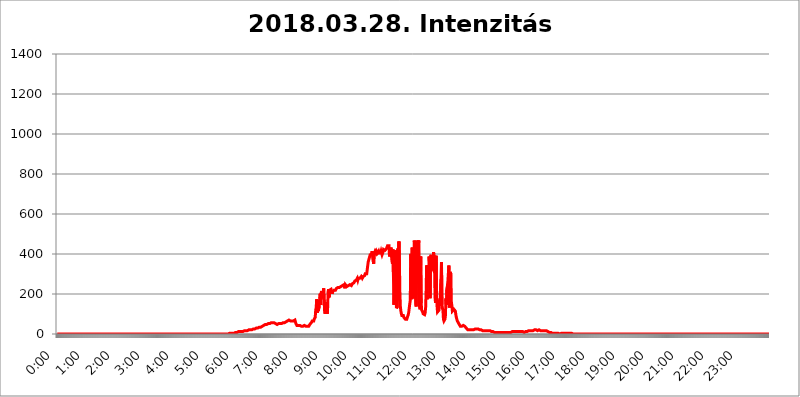
| Category | 2018.03.28. Intenzitás [W/m^2] |
|---|---|
| 0.0 | 0 |
| 0.0006944444444444445 | 0 |
| 0.001388888888888889 | 0 |
| 0.0020833333333333333 | 0 |
| 0.002777777777777778 | 0 |
| 0.003472222222222222 | 0 |
| 0.004166666666666667 | 0 |
| 0.004861111111111111 | 0 |
| 0.005555555555555556 | 0 |
| 0.0062499999999999995 | 0 |
| 0.006944444444444444 | 0 |
| 0.007638888888888889 | 0 |
| 0.008333333333333333 | 0 |
| 0.009027777777777779 | 0 |
| 0.009722222222222222 | 0 |
| 0.010416666666666666 | 0 |
| 0.011111111111111112 | 0 |
| 0.011805555555555555 | 0 |
| 0.012499999999999999 | 0 |
| 0.013194444444444444 | 0 |
| 0.013888888888888888 | 0 |
| 0.014583333333333332 | 0 |
| 0.015277777777777777 | 0 |
| 0.015972222222222224 | 0 |
| 0.016666666666666666 | 0 |
| 0.017361111111111112 | 0 |
| 0.018055555555555557 | 0 |
| 0.01875 | 0 |
| 0.019444444444444445 | 0 |
| 0.02013888888888889 | 0 |
| 0.020833333333333332 | 0 |
| 0.02152777777777778 | 0 |
| 0.022222222222222223 | 0 |
| 0.02291666666666667 | 0 |
| 0.02361111111111111 | 0 |
| 0.024305555555555556 | 0 |
| 0.024999999999999998 | 0 |
| 0.025694444444444447 | 0 |
| 0.02638888888888889 | 0 |
| 0.027083333333333334 | 0 |
| 0.027777777777777776 | 0 |
| 0.02847222222222222 | 0 |
| 0.029166666666666664 | 0 |
| 0.029861111111111113 | 0 |
| 0.030555555555555555 | 0 |
| 0.03125 | 0 |
| 0.03194444444444445 | 0 |
| 0.03263888888888889 | 0 |
| 0.03333333333333333 | 0 |
| 0.034027777777777775 | 0 |
| 0.034722222222222224 | 0 |
| 0.035416666666666666 | 0 |
| 0.036111111111111115 | 0 |
| 0.03680555555555556 | 0 |
| 0.0375 | 0 |
| 0.03819444444444444 | 0 |
| 0.03888888888888889 | 0 |
| 0.03958333333333333 | 0 |
| 0.04027777777777778 | 0 |
| 0.04097222222222222 | 0 |
| 0.041666666666666664 | 0 |
| 0.042361111111111106 | 0 |
| 0.04305555555555556 | 0 |
| 0.043750000000000004 | 0 |
| 0.044444444444444446 | 0 |
| 0.04513888888888889 | 0 |
| 0.04583333333333334 | 0 |
| 0.04652777777777778 | 0 |
| 0.04722222222222222 | 0 |
| 0.04791666666666666 | 0 |
| 0.04861111111111111 | 0 |
| 0.049305555555555554 | 0 |
| 0.049999999999999996 | 0 |
| 0.05069444444444445 | 0 |
| 0.051388888888888894 | 0 |
| 0.052083333333333336 | 0 |
| 0.05277777777777778 | 0 |
| 0.05347222222222222 | 0 |
| 0.05416666666666667 | 0 |
| 0.05486111111111111 | 0 |
| 0.05555555555555555 | 0 |
| 0.05625 | 0 |
| 0.05694444444444444 | 0 |
| 0.057638888888888885 | 0 |
| 0.05833333333333333 | 0 |
| 0.05902777777777778 | 0 |
| 0.059722222222222225 | 0 |
| 0.06041666666666667 | 0 |
| 0.061111111111111116 | 0 |
| 0.06180555555555556 | 0 |
| 0.0625 | 0 |
| 0.06319444444444444 | 0 |
| 0.06388888888888888 | 0 |
| 0.06458333333333334 | 0 |
| 0.06527777777777778 | 0 |
| 0.06597222222222222 | 0 |
| 0.06666666666666667 | 0 |
| 0.06736111111111111 | 0 |
| 0.06805555555555555 | 0 |
| 0.06874999999999999 | 0 |
| 0.06944444444444443 | 0 |
| 0.07013888888888889 | 0 |
| 0.07083333333333333 | 0 |
| 0.07152777777777779 | 0 |
| 0.07222222222222223 | 0 |
| 0.07291666666666667 | 0 |
| 0.07361111111111111 | 0 |
| 0.07430555555555556 | 0 |
| 0.075 | 0 |
| 0.07569444444444444 | 0 |
| 0.0763888888888889 | 0 |
| 0.07708333333333334 | 0 |
| 0.07777777777777778 | 0 |
| 0.07847222222222222 | 0 |
| 0.07916666666666666 | 0 |
| 0.0798611111111111 | 0 |
| 0.08055555555555556 | 0 |
| 0.08125 | 0 |
| 0.08194444444444444 | 0 |
| 0.08263888888888889 | 0 |
| 0.08333333333333333 | 0 |
| 0.08402777777777777 | 0 |
| 0.08472222222222221 | 0 |
| 0.08541666666666665 | 0 |
| 0.08611111111111112 | 0 |
| 0.08680555555555557 | 0 |
| 0.08750000000000001 | 0 |
| 0.08819444444444445 | 0 |
| 0.08888888888888889 | 0 |
| 0.08958333333333333 | 0 |
| 0.09027777777777778 | 0 |
| 0.09097222222222222 | 0 |
| 0.09166666666666667 | 0 |
| 0.09236111111111112 | 0 |
| 0.09305555555555556 | 0 |
| 0.09375 | 0 |
| 0.09444444444444444 | 0 |
| 0.09513888888888888 | 0 |
| 0.09583333333333333 | 0 |
| 0.09652777777777777 | 0 |
| 0.09722222222222222 | 0 |
| 0.09791666666666667 | 0 |
| 0.09861111111111111 | 0 |
| 0.09930555555555555 | 0 |
| 0.09999999999999999 | 0 |
| 0.10069444444444443 | 0 |
| 0.1013888888888889 | 0 |
| 0.10208333333333335 | 0 |
| 0.10277777777777779 | 0 |
| 0.10347222222222223 | 0 |
| 0.10416666666666667 | 0 |
| 0.10486111111111111 | 0 |
| 0.10555555555555556 | 0 |
| 0.10625 | 0 |
| 0.10694444444444444 | 0 |
| 0.1076388888888889 | 0 |
| 0.10833333333333334 | 0 |
| 0.10902777777777778 | 0 |
| 0.10972222222222222 | 0 |
| 0.1111111111111111 | 0 |
| 0.11180555555555556 | 0 |
| 0.11180555555555556 | 0 |
| 0.1125 | 0 |
| 0.11319444444444444 | 0 |
| 0.11388888888888889 | 0 |
| 0.11458333333333333 | 0 |
| 0.11527777777777777 | 0 |
| 0.11597222222222221 | 0 |
| 0.11666666666666665 | 0 |
| 0.1173611111111111 | 0 |
| 0.11805555555555557 | 0 |
| 0.11944444444444445 | 0 |
| 0.12013888888888889 | 0 |
| 0.12083333333333333 | 0 |
| 0.12152777777777778 | 0 |
| 0.12222222222222223 | 0 |
| 0.12291666666666667 | 0 |
| 0.12291666666666667 | 0 |
| 0.12361111111111112 | 0 |
| 0.12430555555555556 | 0 |
| 0.125 | 0 |
| 0.12569444444444444 | 0 |
| 0.12638888888888888 | 0 |
| 0.12708333333333333 | 0 |
| 0.16875 | 0 |
| 0.12847222222222224 | 0 |
| 0.12916666666666668 | 0 |
| 0.12986111111111112 | 0 |
| 0.13055555555555556 | 0 |
| 0.13125 | 0 |
| 0.13194444444444445 | 0 |
| 0.1326388888888889 | 0 |
| 0.13333333333333333 | 0 |
| 0.13402777777777777 | 0 |
| 0.13402777777777777 | 0 |
| 0.13472222222222222 | 0 |
| 0.13541666666666666 | 0 |
| 0.1361111111111111 | 0 |
| 0.13749999999999998 | 0 |
| 0.13819444444444443 | 0 |
| 0.1388888888888889 | 0 |
| 0.13958333333333334 | 0 |
| 0.14027777777777778 | 0 |
| 0.14097222222222222 | 0 |
| 0.14166666666666666 | 0 |
| 0.1423611111111111 | 0 |
| 0.14305555555555557 | 0 |
| 0.14375000000000002 | 0 |
| 0.14444444444444446 | 0 |
| 0.1451388888888889 | 0 |
| 0.1451388888888889 | 0 |
| 0.14652777777777778 | 0 |
| 0.14722222222222223 | 0 |
| 0.14791666666666667 | 0 |
| 0.1486111111111111 | 0 |
| 0.14930555555555555 | 0 |
| 0.15 | 0 |
| 0.15069444444444444 | 0 |
| 0.15138888888888888 | 0 |
| 0.15208333333333332 | 0 |
| 0.15277777777777776 | 0 |
| 0.15347222222222223 | 0 |
| 0.15416666666666667 | 0 |
| 0.15486111111111112 | 0 |
| 0.15555555555555556 | 0 |
| 0.15625 | 0 |
| 0.15694444444444444 | 0 |
| 0.15763888888888888 | 0 |
| 0.15833333333333333 | 0 |
| 0.15902777777777777 | 0 |
| 0.15972222222222224 | 0 |
| 0.16041666666666668 | 0 |
| 0.16111111111111112 | 0 |
| 0.16180555555555556 | 0 |
| 0.1625 | 0 |
| 0.16319444444444445 | 0 |
| 0.1638888888888889 | 0 |
| 0.16458333333333333 | 0 |
| 0.16527777777777777 | 0 |
| 0.16597222222222222 | 0 |
| 0.16666666666666666 | 0 |
| 0.1673611111111111 | 0 |
| 0.16805555555555554 | 0 |
| 0.16874999999999998 | 0 |
| 0.16944444444444443 | 0 |
| 0.17013888888888887 | 0 |
| 0.1708333333333333 | 0 |
| 0.17152777777777775 | 0 |
| 0.17222222222222225 | 0 |
| 0.1729166666666667 | 0 |
| 0.17361111111111113 | 0 |
| 0.17430555555555557 | 0 |
| 0.17500000000000002 | 0 |
| 0.17569444444444446 | 0 |
| 0.1763888888888889 | 0 |
| 0.17708333333333334 | 0 |
| 0.17777777777777778 | 0 |
| 0.17847222222222223 | 0 |
| 0.17916666666666667 | 0 |
| 0.1798611111111111 | 0 |
| 0.18055555555555555 | 0 |
| 0.18125 | 0 |
| 0.18194444444444444 | 0 |
| 0.1826388888888889 | 0 |
| 0.18333333333333335 | 0 |
| 0.1840277777777778 | 0 |
| 0.18472222222222223 | 0 |
| 0.18541666666666667 | 0 |
| 0.18611111111111112 | 0 |
| 0.18680555555555556 | 0 |
| 0.1875 | 0 |
| 0.18819444444444444 | 0 |
| 0.18888888888888888 | 0 |
| 0.18958333333333333 | 0 |
| 0.19027777777777777 | 0 |
| 0.1909722222222222 | 0 |
| 0.19166666666666665 | 0 |
| 0.19236111111111112 | 0 |
| 0.19305555555555554 | 0 |
| 0.19375 | 0 |
| 0.19444444444444445 | 0 |
| 0.1951388888888889 | 0 |
| 0.19583333333333333 | 0 |
| 0.19652777777777777 | 0 |
| 0.19722222222222222 | 0 |
| 0.19791666666666666 | 0 |
| 0.1986111111111111 | 0 |
| 0.19930555555555554 | 0 |
| 0.19999999999999998 | 0 |
| 0.20069444444444443 | 0 |
| 0.20138888888888887 | 0 |
| 0.2020833333333333 | 0 |
| 0.2027777777777778 | 0 |
| 0.2034722222222222 | 0 |
| 0.2041666666666667 | 0 |
| 0.20486111111111113 | 0 |
| 0.20555555555555557 | 0 |
| 0.20625000000000002 | 0 |
| 0.20694444444444446 | 0 |
| 0.2076388888888889 | 0 |
| 0.20833333333333334 | 0 |
| 0.20902777777777778 | 0 |
| 0.20972222222222223 | 0 |
| 0.21041666666666667 | 0 |
| 0.2111111111111111 | 0 |
| 0.21180555555555555 | 0 |
| 0.2125 | 0 |
| 0.21319444444444444 | 0 |
| 0.2138888888888889 | 0 |
| 0.21458333333333335 | 0 |
| 0.2152777777777778 | 0 |
| 0.21597222222222223 | 0 |
| 0.21666666666666667 | 0 |
| 0.21736111111111112 | 0 |
| 0.21805555555555556 | 0 |
| 0.21875 | 0 |
| 0.21944444444444444 | 0 |
| 0.22013888888888888 | 0 |
| 0.22083333333333333 | 0 |
| 0.22152777777777777 | 0 |
| 0.2222222222222222 | 0 |
| 0.22291666666666665 | 0 |
| 0.2236111111111111 | 0 |
| 0.22430555555555556 | 0 |
| 0.225 | 0 |
| 0.22569444444444445 | 0 |
| 0.2263888888888889 | 0 |
| 0.22708333333333333 | 0 |
| 0.22777777777777777 | 0 |
| 0.22847222222222222 | 0 |
| 0.22916666666666666 | 0 |
| 0.2298611111111111 | 0 |
| 0.23055555555555554 | 0 |
| 0.23124999999999998 | 0 |
| 0.23194444444444443 | 0 |
| 0.23263888888888887 | 0 |
| 0.2333333333333333 | 0 |
| 0.2340277777777778 | 0 |
| 0.2347222222222222 | 0 |
| 0.2354166666666667 | 0 |
| 0.23611111111111113 | 0 |
| 0.23680555555555557 | 0 |
| 0.23750000000000002 | 0 |
| 0.23819444444444446 | 0 |
| 0.2388888888888889 | 3.525 |
| 0.23958333333333334 | 0 |
| 0.24027777777777778 | 3.525 |
| 0.24097222222222223 | 3.525 |
| 0.24166666666666667 | 3.525 |
| 0.2423611111111111 | 3.525 |
| 0.24305555555555555 | 3.525 |
| 0.24375 | 3.525 |
| 0.24444444444444446 | 3.525 |
| 0.24513888888888888 | 3.525 |
| 0.24583333333333335 | 3.525 |
| 0.2465277777777778 | 3.525 |
| 0.24722222222222223 | 3.525 |
| 0.24791666666666667 | 3.525 |
| 0.24861111111111112 | 3.525 |
| 0.24930555555555556 | 7.887 |
| 0.25 | 7.887 |
| 0.25069444444444444 | 7.887 |
| 0.2513888888888889 | 7.887 |
| 0.2520833333333333 | 7.887 |
| 0.25277777777777777 | 7.887 |
| 0.2534722222222222 | 7.887 |
| 0.25416666666666665 | 12.257 |
| 0.2548611111111111 | 7.887 |
| 0.2555555555555556 | 12.257 |
| 0.25625000000000003 | 12.257 |
| 0.2569444444444445 | 12.257 |
| 0.2576388888888889 | 12.257 |
| 0.25833333333333336 | 12.257 |
| 0.2590277777777778 | 12.257 |
| 0.25972222222222224 | 12.257 |
| 0.2604166666666667 | 12.257 |
| 0.2611111111111111 | 12.257 |
| 0.26180555555555557 | 12.257 |
| 0.2625 | 16.636 |
| 0.26319444444444445 | 16.636 |
| 0.2638888888888889 | 16.636 |
| 0.26458333333333334 | 16.636 |
| 0.2652777777777778 | 16.636 |
| 0.2659722222222222 | 16.636 |
| 0.26666666666666666 | 16.636 |
| 0.2673611111111111 | 16.636 |
| 0.26805555555555555 | 16.636 |
| 0.26875 | 21.024 |
| 0.26944444444444443 | 21.024 |
| 0.2701388888888889 | 21.024 |
| 0.2708333333333333 | 21.024 |
| 0.27152777777777776 | 21.024 |
| 0.2722222222222222 | 21.024 |
| 0.27291666666666664 | 21.024 |
| 0.2736111111111111 | 21.024 |
| 0.2743055555555555 | 21.024 |
| 0.27499999999999997 | 25.419 |
| 0.27569444444444446 | 25.419 |
| 0.27638888888888885 | 25.419 |
| 0.27708333333333335 | 25.419 |
| 0.2777777777777778 | 25.419 |
| 0.27847222222222223 | 25.419 |
| 0.2791666666666667 | 29.823 |
| 0.2798611111111111 | 29.823 |
| 0.28055555555555556 | 29.823 |
| 0.28125 | 29.823 |
| 0.28194444444444444 | 29.823 |
| 0.2826388888888889 | 29.823 |
| 0.2833333333333333 | 34.234 |
| 0.28402777777777777 | 34.234 |
| 0.2847222222222222 | 34.234 |
| 0.28541666666666665 | 34.234 |
| 0.28611111111111115 | 34.234 |
| 0.28680555555555554 | 38.653 |
| 0.28750000000000003 | 38.653 |
| 0.2881944444444445 | 38.653 |
| 0.2888888888888889 | 38.653 |
| 0.28958333333333336 | 43.079 |
| 0.2902777777777778 | 43.079 |
| 0.29097222222222224 | 43.079 |
| 0.2916666666666667 | 47.511 |
| 0.2923611111111111 | 47.511 |
| 0.29305555555555557 | 47.511 |
| 0.29375 | 47.511 |
| 0.29444444444444445 | 47.511 |
| 0.2951388888888889 | 47.511 |
| 0.29583333333333334 | 51.951 |
| 0.2965277777777778 | 51.951 |
| 0.2972222222222222 | 51.951 |
| 0.29791666666666666 | 51.951 |
| 0.2986111111111111 | 56.398 |
| 0.29930555555555555 | 56.398 |
| 0.3 | 56.398 |
| 0.30069444444444443 | 56.398 |
| 0.3013888888888889 | 56.398 |
| 0.3020833333333333 | 56.398 |
| 0.30277777777777776 | 56.398 |
| 0.3034722222222222 | 56.398 |
| 0.30416666666666664 | 56.398 |
| 0.3048611111111111 | 56.398 |
| 0.3055555555555555 | 51.951 |
| 0.30624999999999997 | 51.951 |
| 0.3069444444444444 | 47.511 |
| 0.3076388888888889 | 47.511 |
| 0.30833333333333335 | 47.511 |
| 0.3090277777777778 | 47.511 |
| 0.30972222222222223 | 47.511 |
| 0.3104166666666667 | 51.951 |
| 0.3111111111111111 | 51.951 |
| 0.31180555555555556 | 51.951 |
| 0.3125 | 51.951 |
| 0.31319444444444444 | 51.951 |
| 0.3138888888888889 | 51.951 |
| 0.3145833333333333 | 51.951 |
| 0.31527777777777777 | 56.398 |
| 0.3159722222222222 | 56.398 |
| 0.31666666666666665 | 56.398 |
| 0.31736111111111115 | 56.398 |
| 0.31805555555555554 | 56.398 |
| 0.31875000000000003 | 56.398 |
| 0.3194444444444445 | 60.85 |
| 0.3201388888888889 | 60.85 |
| 0.32083333333333336 | 60.85 |
| 0.3215277777777778 | 65.31 |
| 0.32222222222222224 | 65.31 |
| 0.3229166666666667 | 65.31 |
| 0.3236111111111111 | 65.31 |
| 0.32430555555555557 | 65.31 |
| 0.325 | 69.775 |
| 0.32569444444444445 | 65.31 |
| 0.3263888888888889 | 65.31 |
| 0.32708333333333334 | 65.31 |
| 0.3277777777777778 | 65.31 |
| 0.3284722222222222 | 65.31 |
| 0.32916666666666666 | 65.31 |
| 0.3298611111111111 | 65.31 |
| 0.33055555555555555 | 65.31 |
| 0.33125 | 65.31 |
| 0.33194444444444443 | 69.775 |
| 0.3326388888888889 | 69.775 |
| 0.3333333333333333 | 69.775 |
| 0.3340277777777778 | 60.85 |
| 0.3347222222222222 | 51.951 |
| 0.3354166666666667 | 47.511 |
| 0.3361111111111111 | 43.079 |
| 0.3368055555555556 | 43.079 |
| 0.33749999999999997 | 43.079 |
| 0.33819444444444446 | 43.079 |
| 0.33888888888888885 | 43.079 |
| 0.33958333333333335 | 43.079 |
| 0.34027777777777773 | 43.079 |
| 0.34097222222222223 | 47.511 |
| 0.3416666666666666 | 38.653 |
| 0.3423611111111111 | 38.653 |
| 0.3430555555555555 | 38.653 |
| 0.34375 | 38.653 |
| 0.3444444444444445 | 38.653 |
| 0.3451388888888889 | 38.653 |
| 0.3458333333333334 | 43.079 |
| 0.34652777777777777 | 43.079 |
| 0.34722222222222227 | 38.653 |
| 0.34791666666666665 | 38.653 |
| 0.34861111111111115 | 38.653 |
| 0.34930555555555554 | 38.653 |
| 0.35000000000000003 | 38.653 |
| 0.3506944444444444 | 38.653 |
| 0.3513888888888889 | 38.653 |
| 0.3520833333333333 | 38.653 |
| 0.3527777777777778 | 38.653 |
| 0.3534722222222222 | 43.079 |
| 0.3541666666666667 | 47.511 |
| 0.3548611111111111 | 47.511 |
| 0.35555555555555557 | 51.951 |
| 0.35625 | 56.398 |
| 0.35694444444444445 | 60.85 |
| 0.3576388888888889 | 65.31 |
| 0.35833333333333334 | 65.31 |
| 0.3590277777777778 | 65.31 |
| 0.3597222222222222 | 65.31 |
| 0.36041666666666666 | 74.246 |
| 0.3611111111111111 | 74.246 |
| 0.36180555555555555 | 83.205 |
| 0.3625 | 119.235 |
| 0.36319444444444443 | 132.814 |
| 0.3638888888888889 | 173.709 |
| 0.3645833333333333 | 105.69 |
| 0.3652777777777778 | 150.964 |
| 0.3659722222222222 | 114.716 |
| 0.3666666666666667 | 110.201 |
| 0.3673611111111111 | 137.347 |
| 0.3680555555555556 | 173.709 |
| 0.36874999999999997 | 201.058 |
| 0.36944444444444446 | 146.423 |
| 0.37013888888888885 | 205.62 |
| 0.37083333333333335 | 214.746 |
| 0.37152777777777773 | 201.058 |
| 0.37222222222222223 | 178.264 |
| 0.3729166666666666 | 210.182 |
| 0.3736111111111111 | 228.436 |
| 0.3743055555555555 | 233 |
| 0.375 | 114.716 |
| 0.3756944444444445 | 101.184 |
| 0.3763888888888889 | 119.235 |
| 0.3770833333333334 | 137.347 |
| 0.37777777777777777 | 160.056 |
| 0.37847222222222227 | 101.184 |
| 0.37916666666666665 | 123.758 |
| 0.37986111111111115 | 210.182 |
| 0.38055555555555554 | 223.873 |
| 0.38125000000000003 | 182.82 |
| 0.3819444444444444 | 219.309 |
| 0.3826388888888889 | 223.873 |
| 0.3833333333333333 | 223.873 |
| 0.3840277777777778 | 223.873 |
| 0.3847222222222222 | 214.746 |
| 0.3854166666666667 | 201.058 |
| 0.3861111111111111 | 210.182 |
| 0.38680555555555557 | 210.182 |
| 0.3875 | 214.746 |
| 0.38819444444444445 | 219.309 |
| 0.3888888888888889 | 219.309 |
| 0.38958333333333334 | 219.309 |
| 0.3902777777777778 | 219.309 |
| 0.3909722222222222 | 223.873 |
| 0.39166666666666666 | 228.436 |
| 0.3923611111111111 | 228.436 |
| 0.39305555555555555 | 233 |
| 0.39375 | 233 |
| 0.39444444444444443 | 237.564 |
| 0.3951388888888889 | 237.564 |
| 0.3958333333333333 | 233 |
| 0.3965277777777778 | 233 |
| 0.3972222222222222 | 233 |
| 0.3979166666666667 | 237.564 |
| 0.3986111111111111 | 237.564 |
| 0.3993055555555556 | 242.127 |
| 0.39999999999999997 | 242.127 |
| 0.40069444444444446 | 246.689 |
| 0.40138888888888885 | 246.689 |
| 0.40208333333333335 | 246.689 |
| 0.40277777777777773 | 237.564 |
| 0.40347222222222223 | 228.436 |
| 0.4041666666666666 | 246.689 |
| 0.4048611111111111 | 242.127 |
| 0.4055555555555555 | 242.127 |
| 0.40625 | 237.564 |
| 0.4069444444444445 | 242.127 |
| 0.4076388888888889 | 242.127 |
| 0.4083333333333334 | 242.127 |
| 0.40902777777777777 | 242.127 |
| 0.40972222222222227 | 242.127 |
| 0.41041666666666665 | 246.689 |
| 0.41111111111111115 | 242.127 |
| 0.41180555555555554 | 242.127 |
| 0.41250000000000003 | 242.127 |
| 0.4131944444444444 | 246.689 |
| 0.4138888888888889 | 251.251 |
| 0.4145833333333333 | 251.251 |
| 0.4152777777777778 | 251.251 |
| 0.4159722222222222 | 255.813 |
| 0.4166666666666667 | 260.373 |
| 0.4173611111111111 | 264.932 |
| 0.41805555555555557 | 269.49 |
| 0.41875 | 264.932 |
| 0.41944444444444445 | 269.49 |
| 0.4201388888888889 | 274.047 |
| 0.42083333333333334 | 278.603 |
| 0.4215277777777778 | 269.49 |
| 0.4222222222222222 | 278.603 |
| 0.42291666666666666 | 278.603 |
| 0.4236111111111111 | 283.156 |
| 0.42430555555555555 | 278.603 |
| 0.425 | 274.047 |
| 0.42569444444444443 | 283.156 |
| 0.4263888888888889 | 287.709 |
| 0.4270833333333333 | 283.156 |
| 0.4277777777777778 | 278.603 |
| 0.4284722222222222 | 278.603 |
| 0.4291666666666667 | 287.709 |
| 0.4298611111111111 | 292.259 |
| 0.4305555555555556 | 292.259 |
| 0.43124999999999997 | 292.259 |
| 0.43194444444444446 | 301.354 |
| 0.43263888888888885 | 296.808 |
| 0.43333333333333335 | 301.354 |
| 0.43402777777777773 | 301.354 |
| 0.43472222222222223 | 305.898 |
| 0.4354166666666666 | 305.898 |
| 0.4361111111111111 | 360.221 |
| 0.4368055555555555 | 369.23 |
| 0.4375 | 378.224 |
| 0.4381944444444445 | 382.715 |
| 0.4388888888888889 | 396.164 |
| 0.4395833333333334 | 396.164 |
| 0.44027777777777777 | 396.164 |
| 0.44097222222222227 | 400.638 |
| 0.44166666666666665 | 414.035 |
| 0.44236111111111115 | 414.035 |
| 0.44305555555555554 | 418.492 |
| 0.44375000000000003 | 351.198 |
| 0.4444444444444444 | 400.638 |
| 0.4451388888888889 | 405.108 |
| 0.4458333333333333 | 414.035 |
| 0.4465277777777778 | 409.574 |
| 0.4472222222222222 | 405.108 |
| 0.4479166666666667 | 414.035 |
| 0.4486111111111111 | 414.035 |
| 0.44930555555555557 | 405.108 |
| 0.45 | 409.574 |
| 0.45069444444444445 | 414.035 |
| 0.4513888888888889 | 405.108 |
| 0.45208333333333334 | 405.108 |
| 0.4527777777777778 | 405.108 |
| 0.4534722222222222 | 405.108 |
| 0.45416666666666666 | 414.035 |
| 0.4548611111111111 | 414.035 |
| 0.45555555555555555 | 396.164 |
| 0.45625 | 400.638 |
| 0.45694444444444443 | 409.574 |
| 0.4576388888888889 | 422.943 |
| 0.4583333333333333 | 422.943 |
| 0.4590277777777778 | 418.492 |
| 0.4597222222222222 | 418.492 |
| 0.4604166666666667 | 414.035 |
| 0.4611111111111111 | 414.035 |
| 0.4618055555555556 | 427.39 |
| 0.46249999999999997 | 431.833 |
| 0.46319444444444446 | 440.702 |
| 0.46388888888888885 | 440.702 |
| 0.46458333333333335 | 440.702 |
| 0.46527777777777773 | 440.702 |
| 0.46597222222222223 | 387.202 |
| 0.4666666666666666 | 391.685 |
| 0.4673611111111111 | 391.685 |
| 0.4680555555555555 | 431.833 |
| 0.46875 | 391.685 |
| 0.4694444444444445 | 364.728 |
| 0.4701388888888889 | 351.198 |
| 0.4708333333333334 | 422.943 |
| 0.47152777777777777 | 292.259 |
| 0.47222222222222227 | 146.423 |
| 0.47291666666666665 | 146.423 |
| 0.47361111111111115 | 337.639 |
| 0.47430555555555554 | 418.492 |
| 0.47500000000000003 | 382.715 |
| 0.4756944444444444 | 128.284 |
| 0.4763888888888889 | 123.758 |
| 0.4770833333333333 | 137.347 |
| 0.4777777777777778 | 427.39 |
| 0.4784722222222222 | 169.156 |
| 0.4791666666666667 | 462.786 |
| 0.4798611111111111 | 369.23 |
| 0.48055555555555557 | 205.62 |
| 0.48125 | 137.347 |
| 0.48194444444444445 | 114.716 |
| 0.4826388888888889 | 101.184 |
| 0.48333333333333334 | 92.184 |
| 0.4840277777777778 | 87.692 |
| 0.4847222222222222 | 96.682 |
| 0.48541666666666666 | 92.184 |
| 0.4861111111111111 | 83.205 |
| 0.48680555555555555 | 83.205 |
| 0.4875 | 78.722 |
| 0.48819444444444443 | 74.246 |
| 0.4888888888888889 | 74.246 |
| 0.4895833333333333 | 74.246 |
| 0.4902777777777778 | 74.246 |
| 0.4909722222222222 | 83.205 |
| 0.4916666666666667 | 87.692 |
| 0.4923611111111111 | 96.682 |
| 0.4930555555555556 | 110.201 |
| 0.49374999999999997 | 132.814 |
| 0.49444444444444446 | 132.814 |
| 0.49513888888888885 | 169.156 |
| 0.49583333333333335 | 400.638 |
| 0.49652777777777773 | 191.937 |
| 0.49722222222222223 | 173.709 |
| 0.4979166666666666 | 431.833 |
| 0.4986111111111111 | 274.047 |
| 0.4993055555555555 | 178.264 |
| 0.5 | 191.937 |
| 0.5006944444444444 | 467.187 |
| 0.5013888888888889 | 449.551 |
| 0.5020833333333333 | 233 |
| 0.5027777777777778 | 150.964 |
| 0.5034722222222222 | 137.347 |
| 0.5041666666666667 | 351.198 |
| 0.5048611111111111 | 467.187 |
| 0.5055555555555555 | 440.702 |
| 0.50625 | 391.685 |
| 0.5069444444444444 | 467.187 |
| 0.5076388888888889 | 150.964 |
| 0.5083333333333333 | 132.814 |
| 0.5090277777777777 | 123.758 |
| 0.5097222222222222 | 387.202 |
| 0.5104166666666666 | 155.509 |
| 0.5111111111111112 | 119.235 |
| 0.5118055555555555 | 114.716 |
| 0.5125000000000001 | 110.201 |
| 0.5131944444444444 | 101.184 |
| 0.513888888888889 | 101.184 |
| 0.5145833333333333 | 96.682 |
| 0.5152777777777778 | 96.682 |
| 0.5159722222222222 | 105.69 |
| 0.5166666666666667 | 132.814 |
| 0.517361111111111 | 214.746 |
| 0.5180555555555556 | 342.162 |
| 0.5187499999999999 | 173.709 |
| 0.5194444444444445 | 342.162 |
| 0.5201388888888888 | 264.932 |
| 0.5208333333333334 | 283.156 |
| 0.5215277777777778 | 387.202 |
| 0.5222222222222223 | 351.198 |
| 0.5229166666666667 | 178.264 |
| 0.5236111111111111 | 387.202 |
| 0.5243055555555556 | 396.164 |
| 0.525 | 378.224 |
| 0.5256944444444445 | 324.052 |
| 0.5263888888888889 | 319.517 |
| 0.5270833333333333 | 333.113 |
| 0.5277777777777778 | 409.574 |
| 0.5284722222222222 | 387.202 |
| 0.5291666666666667 | 328.584 |
| 0.5298611111111111 | 182.82 |
| 0.5305555555555556 | 155.509 |
| 0.53125 | 391.685 |
| 0.5319444444444444 | 233 |
| 0.5326388888888889 | 141.884 |
| 0.5333333333333333 | 110.201 |
| 0.5340277777777778 | 105.69 |
| 0.5347222222222222 | 110.201 |
| 0.5354166666666667 | 119.235 |
| 0.5361111111111111 | 146.423 |
| 0.5368055555555555 | 178.264 |
| 0.5375 | 169.156 |
| 0.5381944444444444 | 274.047 |
| 0.5388888888888889 | 360.221 |
| 0.5395833333333333 | 146.423 |
| 0.5402777777777777 | 128.284 |
| 0.5409722222222222 | 119.235 |
| 0.5416666666666666 | 74.246 |
| 0.5423611111111112 | 65.31 |
| 0.5430555555555555 | 69.775 |
| 0.5437500000000001 | 74.246 |
| 0.5444444444444444 | 92.184 |
| 0.545138888888889 | 178.264 |
| 0.5458333333333333 | 146.423 |
| 0.5465277777777778 | 228.436 |
| 0.5472222222222222 | 242.127 |
| 0.5479166666666667 | 264.932 |
| 0.548611111111111 | 305.898 |
| 0.5493055555555556 | 342.162 |
| 0.5499999999999999 | 132.814 |
| 0.5506944444444445 | 132.814 |
| 0.5513888888888888 | 310.44 |
| 0.5520833333333334 | 296.808 |
| 0.5527777777777778 | 160.056 |
| 0.5534722222222223 | 141.884 |
| 0.5541666666666667 | 114.716 |
| 0.5548611111111111 | 110.201 |
| 0.5555555555555556 | 110.201 |
| 0.55625 | 123.758 |
| 0.5569444444444445 | 119.235 |
| 0.5576388888888889 | 119.235 |
| 0.5583333333333333 | 114.716 |
| 0.5590277777777778 | 96.682 |
| 0.5597222222222222 | 83.205 |
| 0.5604166666666667 | 74.246 |
| 0.5611111111111111 | 65.31 |
| 0.5618055555555556 | 60.85 |
| 0.5625 | 56.398 |
| 0.5631944444444444 | 51.951 |
| 0.5638888888888889 | 47.511 |
| 0.5645833333333333 | 43.079 |
| 0.5652777777777778 | 38.653 |
| 0.5659722222222222 | 38.653 |
| 0.5666666666666667 | 38.653 |
| 0.5673611111111111 | 38.653 |
| 0.5680555555555555 | 43.079 |
| 0.56875 | 43.079 |
| 0.5694444444444444 | 43.079 |
| 0.5701388888888889 | 43.079 |
| 0.5708333333333333 | 43.079 |
| 0.5715277777777777 | 38.653 |
| 0.5722222222222222 | 38.653 |
| 0.5729166666666666 | 34.234 |
| 0.5736111111111112 | 29.823 |
| 0.5743055555555555 | 25.419 |
| 0.5750000000000001 | 25.419 |
| 0.5756944444444444 | 21.024 |
| 0.576388888888889 | 21.024 |
| 0.5770833333333333 | 21.024 |
| 0.5777777777777778 | 21.024 |
| 0.5784722222222222 | 21.024 |
| 0.5791666666666667 | 21.024 |
| 0.579861111111111 | 21.024 |
| 0.5805555555555556 | 16.636 |
| 0.5812499999999999 | 16.636 |
| 0.5819444444444445 | 21.024 |
| 0.5826388888888888 | 21.024 |
| 0.5833333333333334 | 21.024 |
| 0.5840277777777778 | 21.024 |
| 0.5847222222222223 | 21.024 |
| 0.5854166666666667 | 25.419 |
| 0.5861111111111111 | 25.419 |
| 0.5868055555555556 | 25.419 |
| 0.5875 | 25.419 |
| 0.5881944444444445 | 25.419 |
| 0.5888888888888889 | 25.419 |
| 0.5895833333333333 | 25.419 |
| 0.5902777777777778 | 25.419 |
| 0.5909722222222222 | 21.024 |
| 0.5916666666666667 | 21.024 |
| 0.5923611111111111 | 21.024 |
| 0.5930555555555556 | 21.024 |
| 0.59375 | 21.024 |
| 0.5944444444444444 | 21.024 |
| 0.5951388888888889 | 16.636 |
| 0.5958333333333333 | 16.636 |
| 0.5965277777777778 | 16.636 |
| 0.5972222222222222 | 16.636 |
| 0.5979166666666667 | 16.636 |
| 0.5986111111111111 | 16.636 |
| 0.5993055555555555 | 16.636 |
| 0.6 | 16.636 |
| 0.6006944444444444 | 16.636 |
| 0.6013888888888889 | 16.636 |
| 0.6020833333333333 | 16.636 |
| 0.6027777777777777 | 16.636 |
| 0.6034722222222222 | 16.636 |
| 0.6041666666666666 | 16.636 |
| 0.6048611111111112 | 16.636 |
| 0.6055555555555555 | 16.636 |
| 0.6062500000000001 | 16.636 |
| 0.6069444444444444 | 16.636 |
| 0.607638888888889 | 12.257 |
| 0.6083333333333333 | 12.257 |
| 0.6090277777777778 | 12.257 |
| 0.6097222222222222 | 12.257 |
| 0.6104166666666667 | 12.257 |
| 0.611111111111111 | 12.257 |
| 0.6118055555555556 | 12.257 |
| 0.6124999999999999 | 12.257 |
| 0.6131944444444445 | 7.887 |
| 0.6138888888888888 | 7.887 |
| 0.6145833333333334 | 7.887 |
| 0.6152777777777778 | 7.887 |
| 0.6159722222222223 | 7.887 |
| 0.6166666666666667 | 7.887 |
| 0.6173611111111111 | 7.887 |
| 0.6180555555555556 | 7.887 |
| 0.61875 | 7.887 |
| 0.6194444444444445 | 7.887 |
| 0.6201388888888889 | 7.887 |
| 0.6208333333333333 | 7.887 |
| 0.6215277777777778 | 7.887 |
| 0.6222222222222222 | 7.887 |
| 0.6229166666666667 | 7.887 |
| 0.6236111111111111 | 7.887 |
| 0.6243055555555556 | 7.887 |
| 0.625 | 7.887 |
| 0.6256944444444444 | 7.887 |
| 0.6263888888888889 | 7.887 |
| 0.6270833333333333 | 7.887 |
| 0.6277777777777778 | 7.887 |
| 0.6284722222222222 | 7.887 |
| 0.6291666666666667 | 7.887 |
| 0.6298611111111111 | 7.887 |
| 0.6305555555555555 | 7.887 |
| 0.63125 | 7.887 |
| 0.6319444444444444 | 7.887 |
| 0.6326388888888889 | 7.887 |
| 0.6333333333333333 | 7.887 |
| 0.6340277777777777 | 7.887 |
| 0.6347222222222222 | 7.887 |
| 0.6354166666666666 | 7.887 |
| 0.6361111111111112 | 7.887 |
| 0.6368055555555555 | 12.257 |
| 0.6375000000000001 | 12.257 |
| 0.6381944444444444 | 12.257 |
| 0.638888888888889 | 12.257 |
| 0.6395833333333333 | 12.257 |
| 0.6402777777777778 | 12.257 |
| 0.6409722222222222 | 12.257 |
| 0.6416666666666667 | 12.257 |
| 0.642361111111111 | 12.257 |
| 0.6430555555555556 | 12.257 |
| 0.6437499999999999 | 12.257 |
| 0.6444444444444445 | 12.257 |
| 0.6451388888888888 | 12.257 |
| 0.6458333333333334 | 12.257 |
| 0.6465277777777778 | 12.257 |
| 0.6472222222222223 | 12.257 |
| 0.6479166666666667 | 12.257 |
| 0.6486111111111111 | 12.257 |
| 0.6493055555555556 | 12.257 |
| 0.65 | 12.257 |
| 0.6506944444444445 | 12.257 |
| 0.6513888888888889 | 12.257 |
| 0.6520833333333333 | 12.257 |
| 0.6527777777777778 | 12.257 |
| 0.6534722222222222 | 12.257 |
| 0.6541666666666667 | 7.887 |
| 0.6548611111111111 | 7.887 |
| 0.6555555555555556 | 12.257 |
| 0.65625 | 12.257 |
| 0.6569444444444444 | 12.257 |
| 0.6576388888888889 | 12.257 |
| 0.6583333333333333 | 12.257 |
| 0.6590277777777778 | 12.257 |
| 0.6597222222222222 | 12.257 |
| 0.6604166666666667 | 16.636 |
| 0.6611111111111111 | 16.636 |
| 0.6618055555555555 | 21.024 |
| 0.6625 | 21.024 |
| 0.6631944444444444 | 16.636 |
| 0.6638888888888889 | 16.636 |
| 0.6645833333333333 | 16.636 |
| 0.6652777777777777 | 16.636 |
| 0.6659722222222222 | 16.636 |
| 0.6666666666666666 | 16.636 |
| 0.6673611111111111 | 16.636 |
| 0.6680555555555556 | 21.024 |
| 0.6687500000000001 | 21.024 |
| 0.6694444444444444 | 21.024 |
| 0.6701388888888888 | 21.024 |
| 0.6708333333333334 | 21.024 |
| 0.6715277777777778 | 21.024 |
| 0.6722222222222222 | 21.024 |
| 0.6729166666666666 | 16.636 |
| 0.6736111111111112 | 16.636 |
| 0.6743055555555556 | 16.636 |
| 0.6749999999999999 | 21.024 |
| 0.6756944444444444 | 21.024 |
| 0.6763888888888889 | 21.024 |
| 0.6770833333333334 | 16.636 |
| 0.6777777777777777 | 16.636 |
| 0.6784722222222223 | 16.636 |
| 0.6791666666666667 | 16.636 |
| 0.6798611111111111 | 16.636 |
| 0.6805555555555555 | 16.636 |
| 0.68125 | 16.636 |
| 0.6819444444444445 | 16.636 |
| 0.6826388888888889 | 16.636 |
| 0.6833333333333332 | 16.636 |
| 0.6840277777777778 | 16.636 |
| 0.6847222222222222 | 16.636 |
| 0.6854166666666667 | 16.636 |
| 0.686111111111111 | 16.636 |
| 0.6868055555555556 | 16.636 |
| 0.6875 | 12.257 |
| 0.6881944444444444 | 12.257 |
| 0.688888888888889 | 12.257 |
| 0.6895833333333333 | 12.257 |
| 0.6902777777777778 | 7.887 |
| 0.6909722222222222 | 7.887 |
| 0.6916666666666668 | 7.887 |
| 0.6923611111111111 | 7.887 |
| 0.6930555555555555 | 7.887 |
| 0.69375 | 3.525 |
| 0.6944444444444445 | 3.525 |
| 0.6951388888888889 | 3.525 |
| 0.6958333333333333 | 3.525 |
| 0.6965277777777777 | 3.525 |
| 0.6972222222222223 | 3.525 |
| 0.6979166666666666 | 3.525 |
| 0.6986111111111111 | 3.525 |
| 0.6993055555555556 | 3.525 |
| 0.7000000000000001 | 3.525 |
| 0.7006944444444444 | 3.525 |
| 0.7013888888888888 | 3.525 |
| 0.7020833333333334 | 3.525 |
| 0.7027777777777778 | 3.525 |
| 0.7034722222222222 | 0 |
| 0.7041666666666666 | 0 |
| 0.7048611111111112 | 0 |
| 0.7055555555555556 | 0 |
| 0.7062499999999999 | 0 |
| 0.7069444444444444 | 3.525 |
| 0.7076388888888889 | 0 |
| 0.7083333333333334 | 3.525 |
| 0.7090277777777777 | 3.525 |
| 0.7097222222222223 | 3.525 |
| 0.7104166666666667 | 3.525 |
| 0.7111111111111111 | 3.525 |
| 0.7118055555555555 | 3.525 |
| 0.7125 | 3.525 |
| 0.7131944444444445 | 3.525 |
| 0.7138888888888889 | 3.525 |
| 0.7145833333333332 | 3.525 |
| 0.7152777777777778 | 3.525 |
| 0.7159722222222222 | 3.525 |
| 0.7166666666666667 | 3.525 |
| 0.717361111111111 | 3.525 |
| 0.7180555555555556 | 3.525 |
| 0.71875 | 3.525 |
| 0.7194444444444444 | 3.525 |
| 0.720138888888889 | 0 |
| 0.7208333333333333 | 0 |
| 0.7215277777777778 | 3.525 |
| 0.7222222222222222 | 0 |
| 0.7229166666666668 | 0 |
| 0.7236111111111111 | 0 |
| 0.7243055555555555 | 0 |
| 0.725 | 0 |
| 0.7256944444444445 | 0 |
| 0.7263888888888889 | 0 |
| 0.7270833333333333 | 0 |
| 0.7277777777777777 | 0 |
| 0.7284722222222223 | 0 |
| 0.7291666666666666 | 0 |
| 0.7298611111111111 | 0 |
| 0.7305555555555556 | 0 |
| 0.7312500000000001 | 0 |
| 0.7319444444444444 | 0 |
| 0.7326388888888888 | 0 |
| 0.7333333333333334 | 0 |
| 0.7340277777777778 | 0 |
| 0.7347222222222222 | 0 |
| 0.7354166666666666 | 0 |
| 0.7361111111111112 | 0 |
| 0.7368055555555556 | 0 |
| 0.7374999999999999 | 0 |
| 0.7381944444444444 | 0 |
| 0.7388888888888889 | 0 |
| 0.7395833333333334 | 0 |
| 0.7402777777777777 | 0 |
| 0.7409722222222223 | 0 |
| 0.7416666666666667 | 0 |
| 0.7423611111111111 | 0 |
| 0.7430555555555555 | 0 |
| 0.74375 | 0 |
| 0.7444444444444445 | 0 |
| 0.7451388888888889 | 0 |
| 0.7458333333333332 | 0 |
| 0.7465277777777778 | 0 |
| 0.7472222222222222 | 0 |
| 0.7479166666666667 | 0 |
| 0.748611111111111 | 0 |
| 0.7493055555555556 | 0 |
| 0.75 | 0 |
| 0.7506944444444444 | 0 |
| 0.751388888888889 | 0 |
| 0.7520833333333333 | 0 |
| 0.7527777777777778 | 0 |
| 0.7534722222222222 | 0 |
| 0.7541666666666668 | 0 |
| 0.7548611111111111 | 0 |
| 0.7555555555555555 | 0 |
| 0.75625 | 0 |
| 0.7569444444444445 | 0 |
| 0.7576388888888889 | 0 |
| 0.7583333333333333 | 0 |
| 0.7590277777777777 | 0 |
| 0.7597222222222223 | 0 |
| 0.7604166666666666 | 0 |
| 0.7611111111111111 | 0 |
| 0.7618055555555556 | 0 |
| 0.7625000000000001 | 0 |
| 0.7631944444444444 | 0 |
| 0.7638888888888888 | 0 |
| 0.7645833333333334 | 0 |
| 0.7652777777777778 | 0 |
| 0.7659722222222222 | 0 |
| 0.7666666666666666 | 0 |
| 0.7673611111111112 | 0 |
| 0.7680555555555556 | 0 |
| 0.7687499999999999 | 0 |
| 0.7694444444444444 | 0 |
| 0.7701388888888889 | 0 |
| 0.7708333333333334 | 0 |
| 0.7715277777777777 | 0 |
| 0.7722222222222223 | 0 |
| 0.7729166666666667 | 0 |
| 0.7736111111111111 | 0 |
| 0.7743055555555555 | 0 |
| 0.775 | 0 |
| 0.7756944444444445 | 0 |
| 0.7763888888888889 | 0 |
| 0.7770833333333332 | 0 |
| 0.7777777777777778 | 0 |
| 0.7784722222222222 | 0 |
| 0.7791666666666667 | 0 |
| 0.779861111111111 | 0 |
| 0.7805555555555556 | 0 |
| 0.78125 | 0 |
| 0.7819444444444444 | 0 |
| 0.782638888888889 | 0 |
| 0.7833333333333333 | 0 |
| 0.7840277777777778 | 0 |
| 0.7847222222222222 | 0 |
| 0.7854166666666668 | 0 |
| 0.7861111111111111 | 0 |
| 0.7868055555555555 | 0 |
| 0.7875 | 0 |
| 0.7881944444444445 | 0 |
| 0.7888888888888889 | 0 |
| 0.7895833333333333 | 0 |
| 0.7902777777777777 | 0 |
| 0.7909722222222223 | 0 |
| 0.7916666666666666 | 0 |
| 0.7923611111111111 | 0 |
| 0.7930555555555556 | 0 |
| 0.7937500000000001 | 0 |
| 0.7944444444444444 | 0 |
| 0.7951388888888888 | 0 |
| 0.7958333333333334 | 0 |
| 0.7965277777777778 | 0 |
| 0.7972222222222222 | 0 |
| 0.7979166666666666 | 0 |
| 0.7986111111111112 | 0 |
| 0.7993055555555556 | 0 |
| 0.7999999999999999 | 0 |
| 0.8006944444444444 | 0 |
| 0.8013888888888889 | 0 |
| 0.8020833333333334 | 0 |
| 0.8027777777777777 | 0 |
| 0.8034722222222223 | 0 |
| 0.8041666666666667 | 0 |
| 0.8048611111111111 | 0 |
| 0.8055555555555555 | 0 |
| 0.80625 | 0 |
| 0.8069444444444445 | 0 |
| 0.8076388888888889 | 0 |
| 0.8083333333333332 | 0 |
| 0.8090277777777778 | 0 |
| 0.8097222222222222 | 0 |
| 0.8104166666666667 | 0 |
| 0.811111111111111 | 0 |
| 0.8118055555555556 | 0 |
| 0.8125 | 0 |
| 0.8131944444444444 | 0 |
| 0.813888888888889 | 0 |
| 0.8145833333333333 | 0 |
| 0.8152777777777778 | 0 |
| 0.8159722222222222 | 0 |
| 0.8166666666666668 | 0 |
| 0.8173611111111111 | 0 |
| 0.8180555555555555 | 0 |
| 0.81875 | 0 |
| 0.8194444444444445 | 0 |
| 0.8201388888888889 | 0 |
| 0.8208333333333333 | 0 |
| 0.8215277777777777 | 0 |
| 0.8222222222222223 | 0 |
| 0.8229166666666666 | 0 |
| 0.8236111111111111 | 0 |
| 0.8243055555555556 | 0 |
| 0.8250000000000001 | 0 |
| 0.8256944444444444 | 0 |
| 0.8263888888888888 | 0 |
| 0.8270833333333334 | 0 |
| 0.8277777777777778 | 0 |
| 0.8284722222222222 | 0 |
| 0.8291666666666666 | 0 |
| 0.8298611111111112 | 0 |
| 0.8305555555555556 | 0 |
| 0.8312499999999999 | 0 |
| 0.8319444444444444 | 0 |
| 0.8326388888888889 | 0 |
| 0.8333333333333334 | 0 |
| 0.8340277777777777 | 0 |
| 0.8347222222222223 | 0 |
| 0.8354166666666667 | 0 |
| 0.8361111111111111 | 0 |
| 0.8368055555555555 | 0 |
| 0.8375 | 0 |
| 0.8381944444444445 | 0 |
| 0.8388888888888889 | 0 |
| 0.8395833333333332 | 0 |
| 0.8402777777777778 | 0 |
| 0.8409722222222222 | 0 |
| 0.8416666666666667 | 0 |
| 0.842361111111111 | 0 |
| 0.8430555555555556 | 0 |
| 0.84375 | 0 |
| 0.8444444444444444 | 0 |
| 0.845138888888889 | 0 |
| 0.8458333333333333 | 0 |
| 0.8465277777777778 | 0 |
| 0.8472222222222222 | 0 |
| 0.8479166666666668 | 0 |
| 0.8486111111111111 | 0 |
| 0.8493055555555555 | 0 |
| 0.85 | 0 |
| 0.8506944444444445 | 0 |
| 0.8513888888888889 | 0 |
| 0.8520833333333333 | 0 |
| 0.8527777777777777 | 0 |
| 0.8534722222222223 | 0 |
| 0.8541666666666666 | 0 |
| 0.8548611111111111 | 0 |
| 0.8555555555555556 | 0 |
| 0.8562500000000001 | 0 |
| 0.8569444444444444 | 0 |
| 0.8576388888888888 | 0 |
| 0.8583333333333334 | 0 |
| 0.8590277777777778 | 0 |
| 0.8597222222222222 | 0 |
| 0.8604166666666666 | 0 |
| 0.8611111111111112 | 0 |
| 0.8618055555555556 | 0 |
| 0.8624999999999999 | 0 |
| 0.8631944444444444 | 0 |
| 0.8638888888888889 | 0 |
| 0.8645833333333334 | 0 |
| 0.8652777777777777 | 0 |
| 0.8659722222222223 | 0 |
| 0.8666666666666667 | 0 |
| 0.8673611111111111 | 0 |
| 0.8680555555555555 | 0 |
| 0.86875 | 0 |
| 0.8694444444444445 | 0 |
| 0.8701388888888889 | 0 |
| 0.8708333333333332 | 0 |
| 0.8715277777777778 | 0 |
| 0.8722222222222222 | 0 |
| 0.8729166666666667 | 0 |
| 0.873611111111111 | 0 |
| 0.8743055555555556 | 0 |
| 0.875 | 0 |
| 0.8756944444444444 | 0 |
| 0.876388888888889 | 0 |
| 0.8770833333333333 | 0 |
| 0.8777777777777778 | 0 |
| 0.8784722222222222 | 0 |
| 0.8791666666666668 | 0 |
| 0.8798611111111111 | 0 |
| 0.8805555555555555 | 0 |
| 0.88125 | 0 |
| 0.8819444444444445 | 0 |
| 0.8826388888888889 | 0 |
| 0.8833333333333333 | 0 |
| 0.8840277777777777 | 0 |
| 0.8847222222222223 | 0 |
| 0.8854166666666666 | 0 |
| 0.8861111111111111 | 0 |
| 0.8868055555555556 | 0 |
| 0.8875000000000001 | 0 |
| 0.8881944444444444 | 0 |
| 0.8888888888888888 | 0 |
| 0.8895833333333334 | 0 |
| 0.8902777777777778 | 0 |
| 0.8909722222222222 | 0 |
| 0.8916666666666666 | 0 |
| 0.8923611111111112 | 0 |
| 0.8930555555555556 | 0 |
| 0.8937499999999999 | 0 |
| 0.8944444444444444 | 0 |
| 0.8951388888888889 | 0 |
| 0.8958333333333334 | 0 |
| 0.8965277777777777 | 0 |
| 0.8972222222222223 | 0 |
| 0.8979166666666667 | 0 |
| 0.8986111111111111 | 0 |
| 0.8993055555555555 | 0 |
| 0.9 | 0 |
| 0.9006944444444445 | 0 |
| 0.9013888888888889 | 0 |
| 0.9020833333333332 | 0 |
| 0.9027777777777778 | 0 |
| 0.9034722222222222 | 0 |
| 0.9041666666666667 | 0 |
| 0.904861111111111 | 0 |
| 0.9055555555555556 | 0 |
| 0.90625 | 0 |
| 0.9069444444444444 | 0 |
| 0.907638888888889 | 0 |
| 0.9083333333333333 | 0 |
| 0.9090277777777778 | 0 |
| 0.9097222222222222 | 0 |
| 0.9104166666666668 | 0 |
| 0.9111111111111111 | 0 |
| 0.9118055555555555 | 0 |
| 0.9125 | 0 |
| 0.9131944444444445 | 0 |
| 0.9138888888888889 | 0 |
| 0.9145833333333333 | 0 |
| 0.9152777777777777 | 0 |
| 0.9159722222222223 | 0 |
| 0.9166666666666666 | 0 |
| 0.9173611111111111 | 0 |
| 0.9180555555555556 | 0 |
| 0.9187500000000001 | 0 |
| 0.9194444444444444 | 0 |
| 0.9201388888888888 | 0 |
| 0.9208333333333334 | 0 |
| 0.9215277777777778 | 0 |
| 0.9222222222222222 | 0 |
| 0.9229166666666666 | 0 |
| 0.9236111111111112 | 0 |
| 0.9243055555555556 | 0 |
| 0.9249999999999999 | 0 |
| 0.9256944444444444 | 0 |
| 0.9263888888888889 | 0 |
| 0.9270833333333334 | 0 |
| 0.9277777777777777 | 0 |
| 0.9284722222222223 | 0 |
| 0.9291666666666667 | 0 |
| 0.9298611111111111 | 0 |
| 0.9305555555555555 | 0 |
| 0.93125 | 0 |
| 0.9319444444444445 | 0 |
| 0.9326388888888889 | 0 |
| 0.9333333333333332 | 0 |
| 0.9340277777777778 | 0 |
| 0.9347222222222222 | 0 |
| 0.9354166666666667 | 0 |
| 0.936111111111111 | 0 |
| 0.9368055555555556 | 0 |
| 0.9375 | 0 |
| 0.9381944444444444 | 0 |
| 0.938888888888889 | 0 |
| 0.9395833333333333 | 0 |
| 0.9402777777777778 | 0 |
| 0.9409722222222222 | 0 |
| 0.9416666666666668 | 0 |
| 0.9423611111111111 | 0 |
| 0.9430555555555555 | 0 |
| 0.94375 | 0 |
| 0.9444444444444445 | 0 |
| 0.9451388888888889 | 0 |
| 0.9458333333333333 | 0 |
| 0.9465277777777777 | 0 |
| 0.9472222222222223 | 0 |
| 0.9479166666666666 | 0 |
| 0.9486111111111111 | 0 |
| 0.9493055555555556 | 0 |
| 0.9500000000000001 | 0 |
| 0.9506944444444444 | 0 |
| 0.9513888888888888 | 0 |
| 0.9520833333333334 | 0 |
| 0.9527777777777778 | 0 |
| 0.9534722222222222 | 0 |
| 0.9541666666666666 | 0 |
| 0.9548611111111112 | 0 |
| 0.9555555555555556 | 0 |
| 0.9562499999999999 | 0 |
| 0.9569444444444444 | 0 |
| 0.9576388888888889 | 0 |
| 0.9583333333333334 | 0 |
| 0.9590277777777777 | 0 |
| 0.9597222222222223 | 0 |
| 0.9604166666666667 | 0 |
| 0.9611111111111111 | 0 |
| 0.9618055555555555 | 0 |
| 0.9625 | 0 |
| 0.9631944444444445 | 0 |
| 0.9638888888888889 | 0 |
| 0.9645833333333332 | 0 |
| 0.9652777777777778 | 0 |
| 0.9659722222222222 | 0 |
| 0.9666666666666667 | 0 |
| 0.967361111111111 | 0 |
| 0.9680555555555556 | 0 |
| 0.96875 | 0 |
| 0.9694444444444444 | 0 |
| 0.970138888888889 | 0 |
| 0.9708333333333333 | 0 |
| 0.9715277777777778 | 0 |
| 0.9722222222222222 | 0 |
| 0.9729166666666668 | 0 |
| 0.9736111111111111 | 0 |
| 0.9743055555555555 | 0 |
| 0.975 | 0 |
| 0.9756944444444445 | 0 |
| 0.9763888888888889 | 0 |
| 0.9770833333333333 | 0 |
| 0.9777777777777777 | 0 |
| 0.9784722222222223 | 0 |
| 0.9791666666666666 | 0 |
| 0.9798611111111111 | 0 |
| 0.9805555555555556 | 0 |
| 0.9812500000000001 | 0 |
| 0.9819444444444444 | 0 |
| 0.9826388888888888 | 0 |
| 0.9833333333333334 | 0 |
| 0.9840277777777778 | 0 |
| 0.9847222222222222 | 0 |
| 0.9854166666666666 | 0 |
| 0.9861111111111112 | 0 |
| 0.9868055555555556 | 0 |
| 0.9874999999999999 | 0 |
| 0.9881944444444444 | 0 |
| 0.9888888888888889 | 0 |
| 0.9895833333333334 | 0 |
| 0.9902777777777777 | 0 |
| 0.9909722222222223 | 0 |
| 0.9916666666666667 | 0 |
| 0.9923611111111111 | 0 |
| 0.9930555555555555 | 0 |
| 0.99375 | 0 |
| 0.9944444444444445 | 0 |
| 0.9951388888888889 | 0 |
| 0.9958333333333332 | 0 |
| 0.9965277777777778 | 0 |
| 0.9972222222222222 | 0 |
| 0.9979166666666667 | 0 |
| 0.998611111111111 | 0 |
| 0.9993055555555556 | 0 |